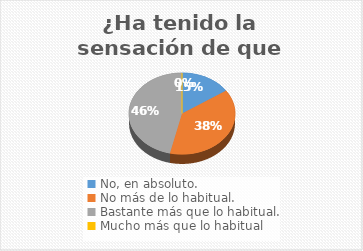
| Category | 4 |
|---|---|
| No, en absoluto. | 17 |
| No más de lo habitual. | 42 |
| Bastante más que lo habitual. | 51 |
| Mucho más que lo habitual | 0 |